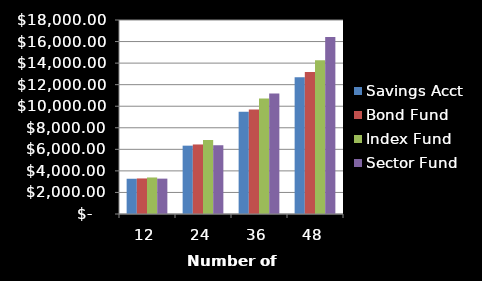
| Category | Savings Acct | Bond Fund | Index Fund | Sector Fund |
|---|---|---|---|---|
| 12.0 | 3270.39 | 3299.592 | 3388.833 | 3281.287 |
| 24.0 | 6340.496 | 6452.177 | 6868.815 | 6379.239 |
| 36.0 | 9476.529 | 9700.673 | 10723.296 | 11191.696 |
| 48.0 | 12695.46 | 13172.593 | 14263.668 | 16429.391 |